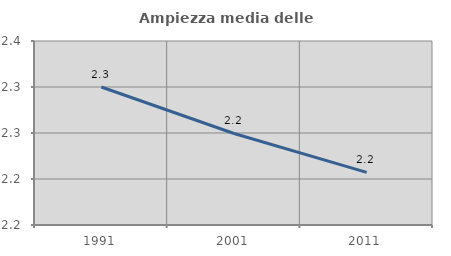
| Category | Ampiezza media delle famiglie |
|---|---|
| 1991.0 | 2.3 |
| 2001.0 | 2.249 |
| 2011.0 | 2.207 |